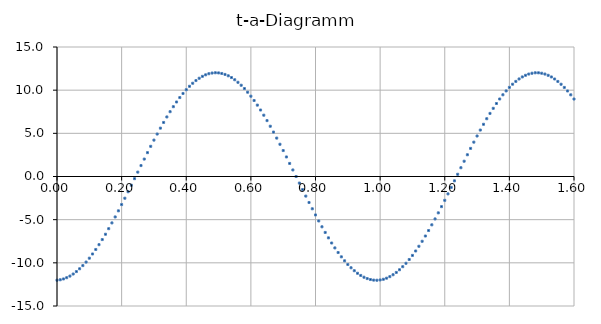
| Category | Series 0 |
|---|---|
| 0.0 | -12.01 |
| 0.01 | -11.962 |
| 0.02 | -11.866 |
| 0.03 | -11.723 |
| 0.04 | -11.532 |
| 0.05 | -11.296 |
| 0.06 | -11.015 |
| 0.07 | -10.689 |
| 0.08 | -10.321 |
| 0.09 | -9.911 |
| 0.1 | -9.462 |
| 0.11 | -8.974 |
| 0.12 | -8.451 |
| 0.13 | -7.895 |
| 0.14 | -7.306 |
| 0.15 | -6.689 |
| 0.16 | -6.044 |
| 0.17 | -5.376 |
| 0.18 | -4.685 |
| 0.19 | -3.977 |
| 0.2 | -3.252 |
| 0.21 | -2.514 |
| 0.22 | -1.766 |
| 0.23 | -1.011 |
| 0.24 | -0.253 |
| 0.25 | 0.507 |
| 0.26 | 1.265 |
| 0.27 | 2.018 |
| 0.28 | 2.763 |
| 0.29 | 3.497 |
| 0.3 | 4.216 |
| 0.31 | 4.919 |
| 0.32 | 5.602 |
| 0.33 | 6.263 |
| 0.34 | 6.899 |
| 0.35 | 7.507 |
| 0.36 | 8.085 |
| 0.37 | 8.631 |
| 0.38 | 9.142 |
| 0.39 | 9.617 |
| 0.4 | 10.053 |
| 0.41 | 10.449 |
| 0.42 | 10.803 |
| 0.43 | 11.114 |
| 0.44 | 11.38 |
| 0.45 | 11.601 |
| 0.46 | 11.776 |
| 0.47 | 11.904 |
| 0.48 | 11.983 |
| 0.49 | 12.015 |
| 0.5 | 11.999 |
| 0.51 | 11.935 |
| 0.52 | 11.823 |
| 0.53 | 11.664 |
| 0.54 | 11.458 |
| 0.55 | 11.207 |
| 0.56 | 10.91 |
| 0.57 | 10.57 |
| 0.58 | 10.188 |
| 0.59 | 9.765 |
| 0.6 | 9.302 |
| 0.61 | 8.803 |
| 0.62 | 8.268 |
| 0.63 | 7.701 |
| 0.64 | 7.102 |
| 0.65 | 6.475 |
| 0.66 | 5.822 |
| 0.67 | 5.146 |
| 0.68 | 4.45 |
| 0.69 | 3.735 |
| 0.7 | 3.006 |
| 0.71 | 2.264 |
| 0.72 | 1.514 |
| 0.73 | 0.757 |
| 0.74 | -0.002 |
| 0.75 | -0.762 |
| 0.76 | -1.518 |
| 0.77 | -2.269 |
| 0.78 | -3.01 |
| 0.790000000000001 | -3.74 |
| 0.8 | -4.454 |
| 0.810000000000001 | -5.151 |
| 0.82 | -5.826 |
| 0.83 | -6.479 |
| 0.84 | -7.106 |
| 0.850000000000001 | -7.704 |
| 0.860000000000001 | -8.272 |
| 0.87 | -8.806 |
| 0.88 | -9.305 |
| 0.890000000000001 | -9.767 |
| 0.900000000000001 | -10.19 |
| 0.910000000000001 | -10.572 |
| 0.92 | -10.912 |
| 0.930000000000001 | -11.208 |
| 0.940000000000001 | -11.46 |
| 0.950000000000001 | -11.665 |
| 0.960000000000001 | -11.824 |
| 0.970000000000001 | -11.936 |
| 0.980000000000001 | -11.999 |
| 0.990000000000001 | -12.015 |
| 1.0 | -11.983 |
| 1.01 | -11.903 |
| 1.02 | -11.775 |
| 1.03 | -11.6 |
| 1.04 | -11.379 |
| 1.05 | -11.112 |
| 1.06 | -10.801 |
| 1.07 | -10.447 |
| 1.08 | -10.05 |
| 1.09 | -9.614 |
| 1.1 | -9.139 |
| 1.11 | -8.628 |
| 1.12 | -8.082 |
| 1.13 | -7.503 |
| 1.14 | -6.895 |
| 1.15 | -6.259 |
| 1.16 | -5.598 |
| 1.17 | -4.915 |
| 1.18 | -4.212 |
| 1.19 | -3.492 |
| 1.2 | -2.758 |
| 1.21 | -2.014 |
| 1.22 | -1.261 |
| 1.23 | -0.503 |
| 1.24 | 0.257 |
| 1.25 | 1.016 |
| 1.26 | 1.771 |
| 1.27 | 2.519 |
| 1.28 | 3.256 |
| 1.29 | 3.981 |
| 1.3 | 4.69 |
| 1.31 | 5.38 |
| 1.32 | 6.048 |
| 1.33 | 6.692 |
| 1.34 | 7.31 |
| 1.35 | 7.898 |
| 1.36 | 8.455 |
| 1.37 | 8.978 |
| 1.38 | 9.464 |
| 1.39 | 9.913 |
| 1.4 | 10.323 |
| 1.41 | 10.691 |
| 1.42 | 11.016 |
| 1.43 | 11.298 |
| 1.44 | 11.534 |
| 1.45 | 11.724 |
| 1.46 | 11.867 |
| 1.47 | 11.962 |
| 1.48 | 12.01 |
| 1.49 | 12.01 |
| 1.5 | 11.962 |
| 1.51 | 11.865 |
| 1.52 | 11.722 |
| 1.53 | 11.531 |
| 1.54 | 11.295 |
| 1.55 | 11.013 |
| 1.56 | 10.687 |
| 1.57 | 10.318 |
| 1.58 | 9.908 |
| 1.59 | 9.459 |
| 1.6 | 8.971 |